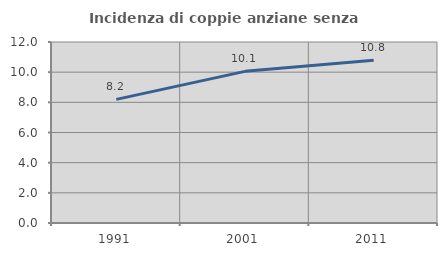
| Category | Incidenza di coppie anziane senza figli  |
|---|---|
| 1991.0 | 8.197 |
| 2001.0 | 10.053 |
| 2011.0 | 10.798 |